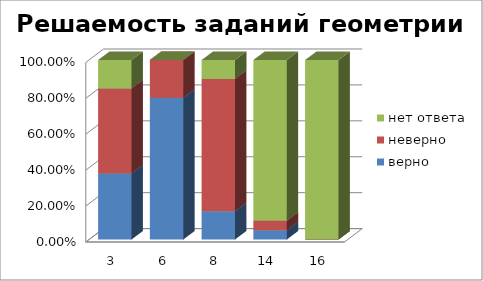
| Category | верно | неверно | нет ответа |
|---|---|---|---|
| 3.0 | 0.368 | 0.474 | 0.158 |
| 6.0 | 0.789 | 0.211 | 0 |
| 8.0 | 0.158 | 0.737 | 0.105 |
| 14.0 | 0.053 | 0.053 | 0.895 |
| 16.0 | 0 | 0 | 1 |